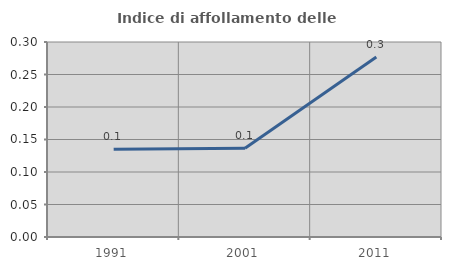
| Category | Indice di affollamento delle abitazioni  |
|---|---|
| 1991.0 | 0.135 |
| 2001.0 | 0.136 |
| 2011.0 | 0.277 |